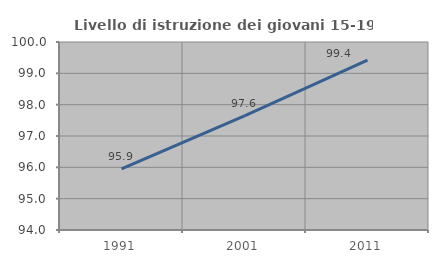
| Category | Livello di istruzione dei giovani 15-19 anni |
|---|---|
| 1991.0 | 95.949 |
| 2001.0 | 97.643 |
| 2011.0 | 99.42 |